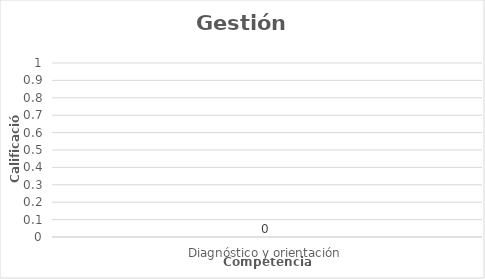
| Category | Series 0 |
|---|---|
| Diagnóstico y orientación | 0 |